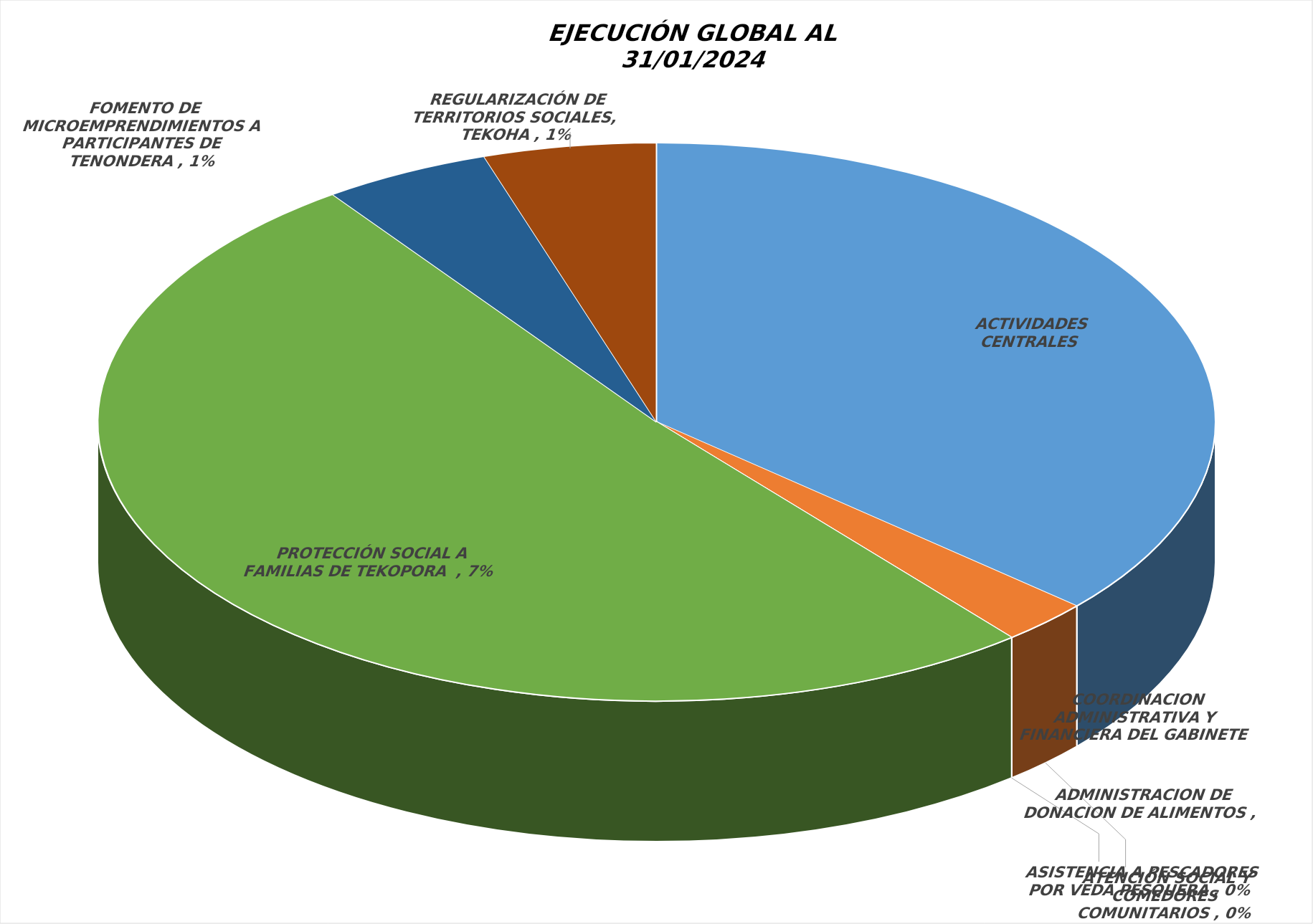
| Category | Series 0 |
|---|---|
| ACTIVIDADES CENTRALES ADMINISTRATIVAS | 0.048 |
| ATENCIÓN SOCIAL Y COMEDORES COMUNITARIOS | 0.003 |
| ASISTENCIA A PESCADORES POR VEDA PESQUERA | 0 |
| ADMINISTRACION DE DONACION DE ALIMENTOS | 0 |
| COORDINACION ADMINISTRATIVA Y FINANCIERA DEL GABINETE SOCIAL  | 0 |
| PROTECCIÓN SOCIAL A FAMILIAS DE TEKOPORA  | 0.067 |
| FOMENTO DE MICROEMPRENDIMIENTOS A PARTICIPANTES DE TENONDERA | 0.006 |
| REGULARIZACIÓN DE TERRITORIOS SOCIALES, TEKOHA | 0.007 |